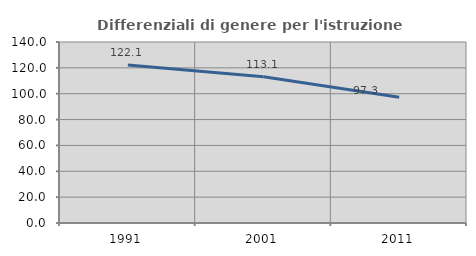
| Category | Differenziali di genere per l'istruzione superiore |
|---|---|
| 1991.0 | 122.133 |
| 2001.0 | 113.068 |
| 2011.0 | 97.267 |